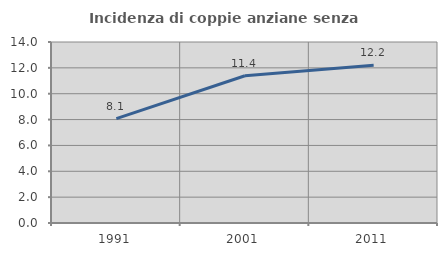
| Category | Incidenza di coppie anziane senza figli  |
|---|---|
| 1991.0 | 8.077 |
| 2001.0 | 11.39 |
| 2011.0 | 12.203 |